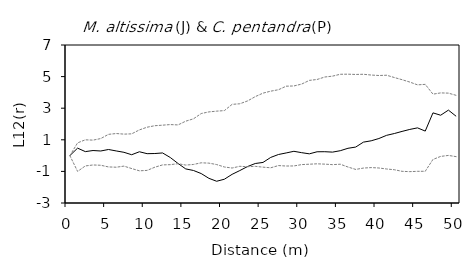
| Category | L12(r) | E12- | E12+ |
|---|---|---|---|
| 0.0 | 0 | 0 | 0 |
| 1.0 | 0.472 | -1 | 0.805 |
| 2.0 | 0.252 | -0.655 | 0.999 |
| 3.0 | 0.322 | -0.593 | 0.979 |
| 4.0 | 0.292 | -0.611 | 1.079 |
| 5.0 | 0.386 | -0.717 | 1.345 |
| 6.0 | 0.295 | -0.735 | 1.397 |
| 7.0 | 0.209 | -0.666 | 1.359 |
| 8.0 | 0.055 | -0.82 | 1.377 |
| 9.0 | 0.243 | -0.964 | 1.626 |
| 10.0 | 0.121 | -0.937 | 1.797 |
| 11.0 | 0.131 | -0.734 | 1.892 |
| 12.0 | 0.168 | -0.589 | 1.926 |
| 13.0 | -0.12 | -0.573 | 1.963 |
| 14.0 | -0.499 | -0.512 | 1.942 |
| 15.0 | -0.843 | -0.6 | 2.179 |
| 16.0 | -0.942 | -0.56 | 2.328 |
| 17.0 | -1.136 | -0.456 | 2.662 |
| 18.0 | -1.439 | -0.477 | 2.766 |
| 19.0 | -1.624 | -0.568 | 2.813 |
| 20.0 | -1.495 | -0.721 | 2.848 |
| 21.0 | -1.186 | -0.786 | 3.243 |
| 22.0 | -0.947 | -0.676 | 3.28 |
| 23.0 | -0.692 | -0.705 | 3.459 |
| 24.0 | -0.5 | -0.679 | 3.733 |
| 25.0 | -0.433 | -0.731 | 3.953 |
| 26.0 | -0.114 | -0.771 | 4.078 |
| 27.0 | 0.069 | -0.631 | 4.168 |
| 28.0 | 0.168 | -0.66 | 4.393 |
| 29.0 | 0.272 | -0.654 | 4.408 |
| 30.0 | 0.186 | -0.57 | 4.526 |
| 31.0 | 0.112 | -0.545 | 4.76 |
| 32.0 | 0.242 | -0.52 | 4.818 |
| 33.0 | 0.246 | -0.541 | 4.974 |
| 34.0 | 0.22 | -0.571 | 5.029 |
| 35.0 | 0.31 | -0.545 | 5.148 |
| 36.0 | 0.463 | -0.722 | 5.153 |
| 37.0 | 0.541 | -0.875 | 5.135 |
| 38.0 | 0.852 | -0.789 | 5.147 |
| 39.0 | 0.937 | -0.759 | 5.099 |
| 40.0 | 1.081 | -0.784 | 5.069 |
| 41.0 | 1.283 | -0.848 | 5.086 |
| 42.0 | 1.397 | -0.894 | 4.942 |
| 43.0 | 1.53 | -0.995 | 4.804 |
| 44.0 | 1.656 | -1.015 | 4.654 |
| 45.0 | 1.755 | -0.995 | 4.478 |
| 46.0 | 1.551 | -0.992 | 4.509 |
| 47.0 | 2.705 | -0.243 | 3.889 |
| 48.0 | 2.555 | -0.051 | 3.968 |
| 49.0 | 2.878 | 0.01 | 3.954 |
| 50.0 | 2.49 | -0.065 | 3.814 |